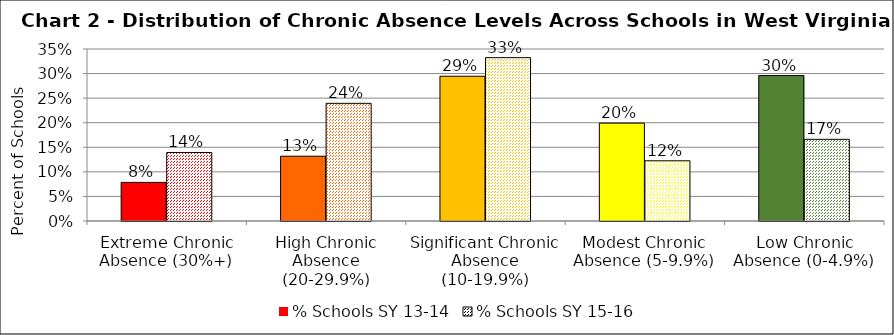
| Category | % Schools SY 13-14 | % Schools SY 15-16 |
|---|---|---|
| Extreme Chronic Absence (30%+) | 0.079 | 0.139 |
| High Chronic Absence (20-29.9%) | 0.132 | 0.239 |
| Significant Chronic Absence (10-19.9%) | 0.295 | 0.332 |
| Modest Chronic Absence (5-9.9%) | 0.199 | 0.123 |
| Low Chronic Absence (0-4.9%) | 0.296 | 0.166 |